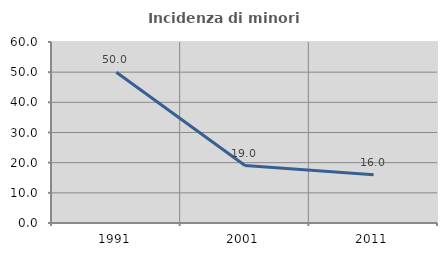
| Category | Incidenza di minori stranieri |
|---|---|
| 1991.0 | 50 |
| 2001.0 | 19.048 |
| 2011.0 | 16.026 |